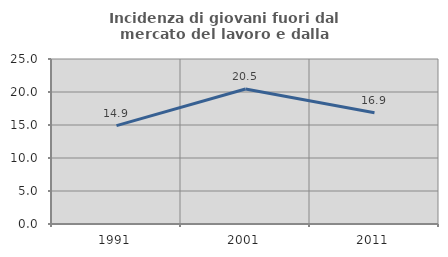
| Category | Incidenza di giovani fuori dal mercato del lavoro e dalla formazione  |
|---|---|
| 1991.0 | 14.912 |
| 2001.0 | 20.463 |
| 2011.0 | 16.855 |